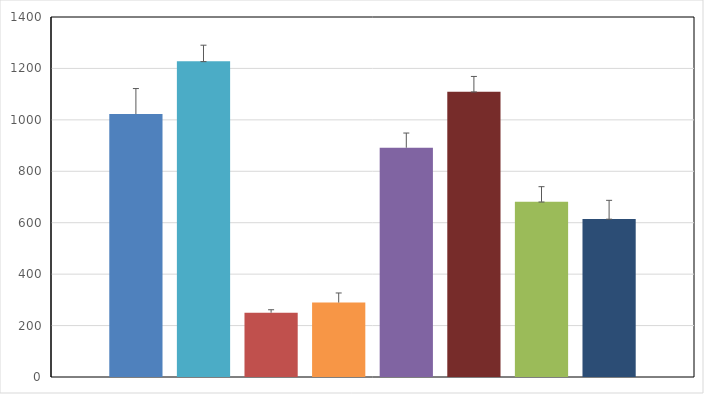
| Category | 5-HT4 | 5-HT-S | MDL | MDL-S | RS127445 | RS10221 | RS10221-S |
|---|---|---|---|---|---|---|---|
| 0 | 1022.52 | 1227.485 | 250.028 | 289.452 | 1109.568 | 681.488 | 614.761 |